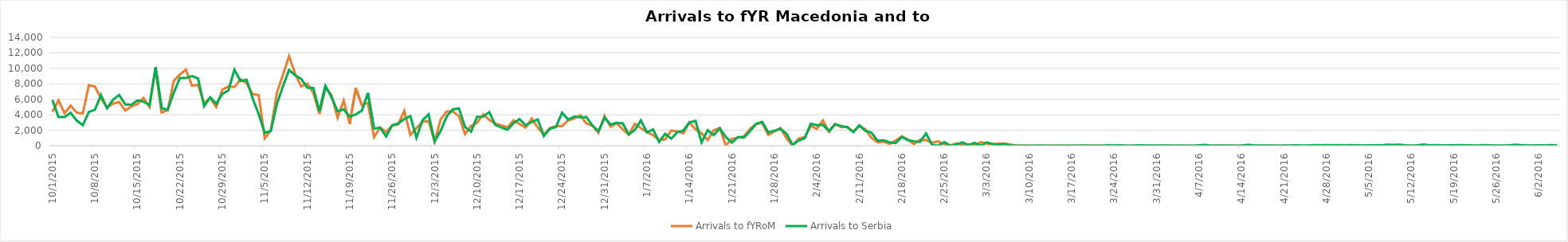
| Category | Arrivals to fYRoM | Arrivals to Serbia |
|---|---|---|
| 10/1/15 | 4370 | 5900 |
| 10/2/15 | 5853 | 3700 |
| 10/3/15 | 4202 | 3700 |
| 10/4/15 | 5181 | 4250 |
| 10/5/15 | 4282 | 3250 |
| 10/6/15 | 4156 | 2650 |
| 10/7/15 | 7816 | 4350 |
| 10/8/15 | 7663 | 4650 |
| 10/9/15 | 6107 | 6550 |
| 10/10/15 | 4922 | 4850 |
| 10/11/15 | 5448 | 5950 |
| 10/12/15 | 5645 | 6556 |
| 10/13/15 | 4551 | 5330 |
| 10/14/15 | 5073 | 5280 |
| 10/15/15 | 5373 | 5850 |
| 10/16/15 | 6181 | 5700 |
| 10/17/15 | 4988 | 5250 |
| 10/18/15 | 10005 | 10150 |
| 10/19/15 | 4299 | 4850 |
| 10/20/15 | 4584 | 4650 |
| 10/21/15 | 8384 | 6850 |
| 10/22/15 | 9174 | 8750 |
| 10/23/15 | 9840 | 8750 |
| 10/24/15 | 7752 | 9000 |
| 10/25/15 | 7864 | 8700 |
| 10/26/15 | 5500 | 5100 |
| 10/27/15 | 6146 | 6257 |
| 10/28/15 | 5000 | 5415 |
| 10/29/15 | 7231 | 6700 |
| 10/30/15 | 7663 | 7138 |
| 10/31/15 | 7590 | 9834 |
| 11/1/15 | 8584 | 8354 |
| 11/2/15 | 8075 | 8521 |
| 11/3/15 | 6682 | 6129 |
| 11/4/15 | 6532 | 4073 |
| 11/5/15 | 960 | 1652 |
| 11/6/15 | 1987 | 1906 |
| 11/7/15 | 6847 | 5397 |
| 11/8/15 | 9148 | 7695 |
| 11/9/15 | 11572 | 9785 |
| 11/10/15 | 9305 | 9107 |
| 11/11/15 | 7651 | 8648 |
| 11/12/15 | 8038 | 7500 |
| 11/13/15 | 6826 | 7464 |
| 11/14/15 | 4107 | 4453 |
| 11/15/15 | 7511 | 7734 |
| 11/16/15 | 6557 | 6267 |
| 11/17/15 | 3621 | 4460 |
| 11/18/15 | 5831 | 4694 |
| 11/19/15 | 2816 | 3765 |
| 11/20/15 | 7453 | 4042 |
| 11/21/15 | 5255 | 4527 |
| 11/22/15 | 5539 | 6826 |
| 11/23/15 | 1113 | 2201 |
| 11/24/15 | 2347 | 2335 |
| 11/25/15 | 1779 | 1194 |
| 11/26/15 | 2617 | 2636 |
| 11/27/15 | 2744 | 2878 |
| 11/28/15 | 4520 | 3454 |
| 11/29/15 | 1373 | 3825 |
| 11/30/15 | 2270 | 1009 |
| 12/1/15 | 3094 | 3284 |
| 12/2/15 | 3174 | 4040 |
| 12/3/15 | 494 | 553 |
| 12/4/15 | 3436 | 1927 |
| 12/5/15 | 4430 | 3799 |
| 12/6/15 | 4425 | 4686 |
| 12/7/15 | 3826 | 4823 |
| 12/8/15 | 1508 | 2437 |
| 12/9/15 | 2550 | 1807 |
| 12/10/15 | 2956 | 3723 |
| 12/11/15 | 4047 | 3747 |
| 12/12/15 | 3338 | 4339 |
| 12/13/15 | 2849 | 2698 |
| 12/14/15 | 2644 | 2353 |
| 12/15/15 | 2349 | 2067 |
| 12/16/15 | 3264 | 2916 |
| 12/17/15 | 2801 | 3438 |
| 12/18/15 | 2332 | 2649 |
| 12/19/15 | 3515 | 3052 |
| 12/20/15 | 2338 | 3405 |
| 12/21/15 | 1470 | 1253 |
| 12/22/15 | 2272 | 2186 |
| 12/23/15 | 2529 | 2415 |
| 12/24/15 | 2529 | 4279 |
| 12/25/15 | 3268 | 3390 |
| 12/26/15 | 3521 | 3757 |
| 12/27/15 | 3938 | 3674 |
| 12/28/15 | 2884 | 3708 |
| 12/29/15 | 2577 | 2629 |
| 12/30/15 | 1665 | 1879 |
| 12/31/15 | 3848 | 3602 |
| 1/1/16 | 2454 | 2745 |
| 1/2/16 | 2918 | 2947 |
| 1/3/16 | 2112 | 2889 |
| 1/4/16 | 1415 | 1462 |
| 1/5/16 | 2842 | 2041 |
| 1/6/16 | 2258 | 3273 |
| 1/7/16 | 1776 | 1715 |
| 1/8/16 | 1344 | 2100 |
| 1/9/16 | 715 | 489 |
| 1/10/16 | 819 | 1538 |
| 1/11/16 | 1959 | 905 |
| 1/12/16 | 1840 | 1743 |
| 1/13/16 | 1600 | 1973 |
| 1/14/16 | 3022 | 3006 |
| 1/15/16 | 2119 | 3213 |
| 1/16/16 | 1598 | 415 |
| 1/17/16 | 720 | 1995 |
| 1/18/16 | 1980 | 1362 |
| 1/19/16 | 2298 | 2244 |
| 1/20/16 | 0 | 1113 |
| 1/21/16 | 892 | 397 |
| 1/22/16 | 1030 | 1134 |
| 1/23/16 | 1208 | 1064 |
| 1/24/16 | 2174 | 1895 |
| 1/25/16 | 2836 | 2827 |
| 1/26/16 | 2908 | 3091 |
| 1/27/16 | 1402 | 1695 |
| 1/28/16 | 1837 | 1940 |
| 1/29/16 | 2292 | 2167 |
| 1/30/16 | 931 | 1540 |
| 1/31/16 | 0 | 103 |
| 2/1/16 | 908 | 660 |
| 2/2/16 | 1121 | 966 |
| 2/3/16 | 2558 | 2825 |
| 2/4/16 | 2173 | 2653 |
| 2/5/16 | 3259 | 2694 |
| 2/6/16 | 1780 | 1901 |
| 2/7/16 | 2838 | 2739 |
| 2/8/16 | 2392 | 2563 |
| 2/9/16 | 2441 | 2379 |
| 2/10/16 | 1817 | 1758 |
| 2/11/16 | 2540 | 2636 |
| 2/12/16 | 2115 | 1923 |
| 2/13/16 | 1019 | 1699 |
| 2/14/16 | 452 | 641 |
| 2/15/16 | 542 | 691 |
| 2/16/16 | 234 | 443 |
| 2/17/16 | 668 | 345 |
| 2/18/16 | 1200 | 1117 |
| 2/19/16 | 799 | 713 |
| 2/20/16 | 209 | 580 |
| 2/21/16 | 774 | 476 |
| 2/22/16 | 714 | 1595 |
| 2/23/16 | 382 | 106 |
| 2/24/16 | 551 | 1 |
| 2/25/16 | 168 | 475 |
| 2/26/16 | 20 | 0 |
| 2/27/16 | 310 | 158 |
| 2/28/16 | 92 | 431 |
| 2/29/16 | 208 | 69 |
| 3/1/16 | 30 | 372 |
| 3/2/16 | 457 | 16 |
| 3/3/16 | 269 | 428 |
| 3/4/16 | 177 | 218 |
| 3/5/16 | 293 | 115 |
| 3/6/16 | 261 | 236 |
| 3/7/16 | 127 | 14 |
| 3/8/16 | 0 | 0 |
| 3/9/16 | 0 | 3 |
| 3/10/16 | 0 | 0 |
| 3/11/16 | 0 | 0 |
| 3/12/16 | 0 | 35 |
| 3/13/16 | 0 | 12 |
| 3/14/16 | 0 | 0 |
| 3/15/16 | 0 | 0 |
| 3/16/16 | 0 | 0 |
| 3/17/16 | 0 | 0 |
| 3/18/16 | 0 | 0 |
| 3/19/16 | 0 | 30 |
| 3/20/16 | 0 | 0 |
| 3/21/16 | 0 | 0 |
| 3/22/16 | 0 | 0 |
| 3/23/16 | 0 | 49 |
| 3/24/16 | 0 | 31 |
| 3/25/16 | 0 | 40 |
| 3/26/16 | 0 | 0 |
| 3/27/16 | 0 | 4 |
| 3/28/16 | 0 | 42 |
| 3/29/16 | 0 | 37 |
| 3/30/16 | 0 | 21 |
| 3/31/16 | 0 | 14 |
| 4/1/16 | 0 | 28 |
| 4/2/16 | 0 | 32 |
| 4/3/16 | 0 | 10 |
| 4/4/16 | 0 | 28 |
| 4/5/16 | 0 | 0 |
| 4/6/16 | 0 | 4 |
| 4/7/16 | 0 | 58 |
| 4/8/16 | 0 | 93 |
| 4/9/16 | 0 | 8 |
| 4/10/16 | 0 | 30 |
| 4/11/16 | 0 | 34 |
| 4/12/16 | 0 | 22 |
| 4/13/16 | 0 | 3 |
| 4/14/16 | 0 | 34 |
| 4/15/16 | 0 | 90 |
| 4/16/16 | 0 | 41 |
| 4/17/16 | 0 | 15 |
| 4/18/16 | 0 | 17 |
| 4/19/16 | 0 | 34 |
| 4/20/16 | 0 | 5 |
| 4/21/16 | 0 | 31 |
| 4/22/16 | 0 | 19 |
| 4/23/16 | 0 | 45 |
| 4/24/16 | 0 | 38 |
| 4/25/16 | 0 | 34 |
| 4/26/16 | 0 | 73 |
| 4/27/16 | 0 | 54 |
| 4/28/16 | 0 | 69 |
| 4/29/16 | 0 | 59 |
| 4/30/16 | 0 | 80 |
| 5/1/16 | 0 | 26 |
| 5/2/16 | 0 | 81 |
| 5/3/16 | 0 | 50 |
| 5/4/16 | 0 | 25 |
| 5/5/16 | 0 | 58 |
| 5/6/16 | 0 | 49 |
| 5/7/16 | 0 | 59 |
| 5/8/16 | 0 | 128 |
| 5/9/16 | 0 | 113 |
| 5/10/16 | 0 | 119 |
| 5/11/16 | 0 | 62 |
| 5/12/16 | 0 | 33 |
| 5/13/16 | 0 | 51 |
| 5/14/16 | 0 | 161 |
| 5/15/16 | 0 | 45 |
| 5/16/16 | 0 | 71 |
| 5/17/16 | 0 | 17 |
| 5/18/16 | 0 | 44 |
| 5/19/16 | 0 | 55 |
| 5/20/16 | 0 | 74 |
| 5/21/16 | 0 | 39 |
| 5/22/16 | 0 | 16 |
| 5/23/16 | 0 | 15 |
| 5/24/16 | 0 | 68 |
| 5/25/16 | 0 | 23 |
| 5/26/16 | 0 | 15 |
| 5/27/16 | 0 | 20 |
| 5/28/16 | 0 | 35 |
| 5/29/16 | 0 | 121 |
| 5/30/16 | 0 | 75 |
| 5/31/16 | 0 | 37 |
| 6/1/16 | 0 | 29 |
| 6/2/16 | 0 | 43 |
| 6/3/16 | 0 | 32 |
| 6/4/16 | 0 | 80 |
| 6/5/16 | 0 | 26 |